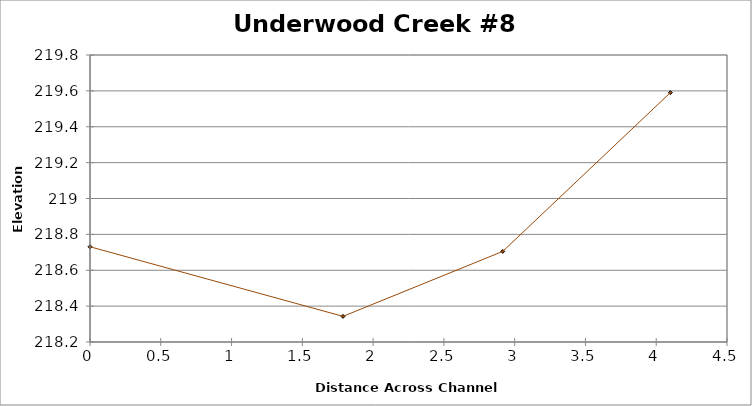
| Category | Series 0 |
|---|---|
| 0.0 | 218.731 |
| 1.787316424109611 | 218.343 |
| 2.9156711068808208 | 218.705 |
| 4.099871827973078 | 219.59 |